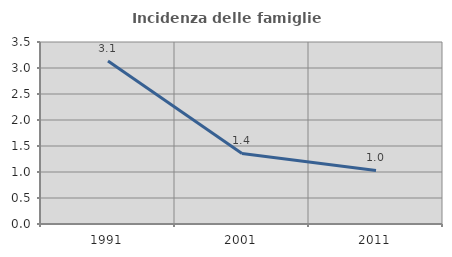
| Category | Incidenza delle famiglie numerose |
|---|---|
| 1991.0 | 3.133 |
| 2001.0 | 1.358 |
| 2011.0 | 1.029 |